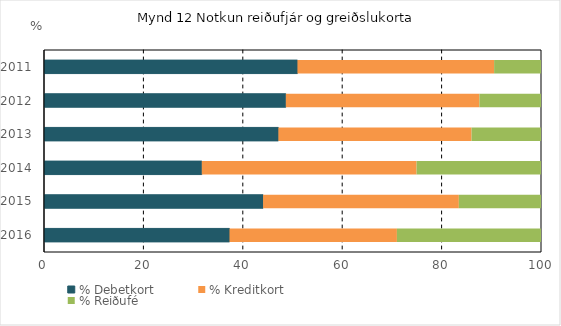
| Category | % Debetkort | % Kreditkort | % Reiðufé |
|---|---|---|---|
| 2011.0 | 50.995 | 39.571 | 9.433 |
| 2012.0 | 48.66 | 38.947 | 12.393 |
| 2013.0 | 47.156 | 38.873 | 13.971 |
| 2014.0 | 31.751 | 43.213 | 25.036 |
| 2015.0 | 44.079 | 39.394 | 16.527 |
| 2016.0 | 37.321 | 33.688 | 28.991 |